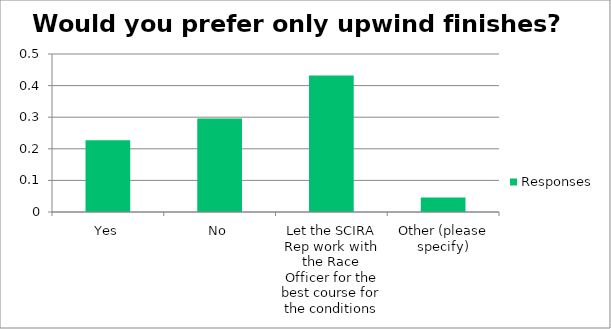
| Category | Responses |
|---|---|
| _x0003_Yes | 0.227 |
| _x0002_No | 0.296 |
| SLet the SCIRA Rep work with the Race Officer for the best course for the conditions | 0.432 |
| _x0016_Other (please specify) | 0.046 |